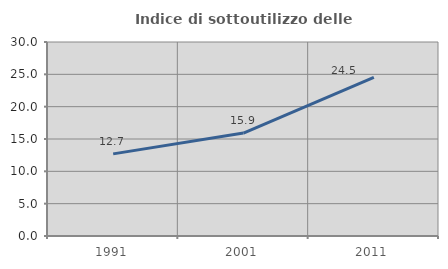
| Category | Indice di sottoutilizzo delle abitazioni  |
|---|---|
| 1991.0 | 12.702 |
| 2001.0 | 15.915 |
| 2011.0 | 24.544 |